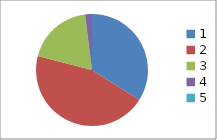
| Category | Series 0 |
|---|---|
| 0 | 0.34 |
| 1 | 0.45 |
| 2 | 0.19 |
| 3 | 0.02 |
| 4 | 0 |